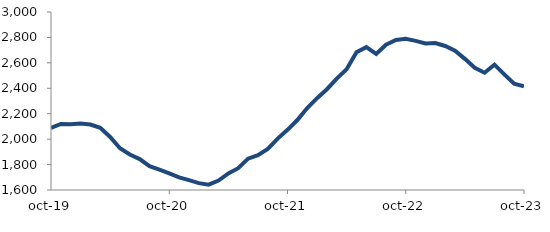
| Category | Series 0 |
|---|---|
| 2019-10-01 | 2088.553 |
| 2019-11-01 | 2119.211 |
| 2019-12-01 | 2116.27 |
| 2020-01-01 | 2123.179 |
| 2020-02-01 | 2115.217 |
| 2020-03-01 | 2088.6 |
| 2020-04-01 | 2017.241 |
| 2020-05-01 | 1928.116 |
| 2020-06-01 | 1878.979 |
| 2020-07-01 | 1843.29 |
| 2020-08-01 | 1787.543 |
| 2020-09-01 | 1760.281 |
| 2020-10-01 | 1731.197 |
| 2020-11-01 | 1698.835 |
| 2020-12-01 | 1677.184 |
| 2021-01-01 | 1654.072 |
| 2021-02-01 | 1641.869 |
| 2021-03-01 | 1673.821 |
| 2021-04-01 | 1730.759 |
| 2021-05-01 | 1771.425 |
| 2021-06-01 | 1846.573 |
| 2021-07-01 | 1874.111 |
| 2021-08-01 | 1922.894 |
| 2021-09-01 | 2004.225 |
| 2021-10-01 | 2073.331 |
| 2021-11-01 | 2150.314 |
| 2021-12-01 | 2244.492 |
| 2022-01-01 | 2321.95 |
| 2022-02-01 | 2392.65 |
| 2022-03-01 | 2476.383 |
| 2022-04-01 | 2549.069 |
| 2022-05-01 | 2683.336 |
| 2022-06-01 | 2723.868 |
| 2022-07-01 | 2670.585 |
| 2022-08-01 | 2742.913 |
| 2022-09-01 | 2780.46 |
| 2022-10-01 | 2788.916 |
| 2022-11-01 | 2772.628 |
| 2022-12-01 | 2752.307 |
| 2023-01-01 | 2755.69 |
| 2023-02-01 | 2732.653 |
| 2023-03-01 | 2696.107 |
| 2023-04-01 | 2631.454 |
| 2023-05-01 | 2561.826 |
| 2023-06-01 | 2522.703 |
| 2023-07-01 | 2586.296 |
| 2023-08-01 | 2509.777 |
| 2023-09-01 | 2436.109 |
| 2023-10-01 | 2416.11 |